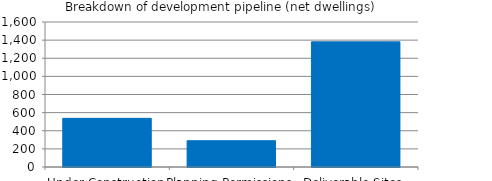
| Category | Series 0 |
|---|---|
| Under Construction | 537 |
| Planning Permissions | 290 |
| Deliverable Sites | 1381 |